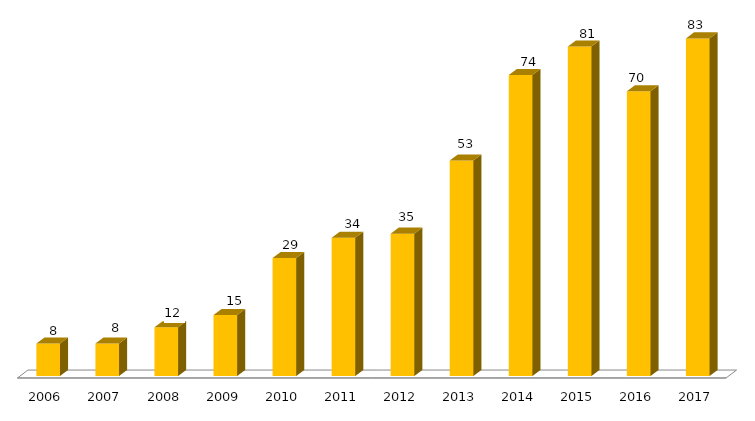
| Category | Programa |
|---|---|
| 2006.0 | 8 |
| 2007.0 | 8 |
| 2008.0 | 12 |
| 2009.0 | 15 |
| 2010.0 | 29 |
| 2011.0 | 34 |
| 2012.0 | 35 |
| 2013.0 | 53 |
| 2014.0 | 74 |
| 2015.0 | 81 |
| 2016.0 | 70 |
| 2017.0 | 83 |